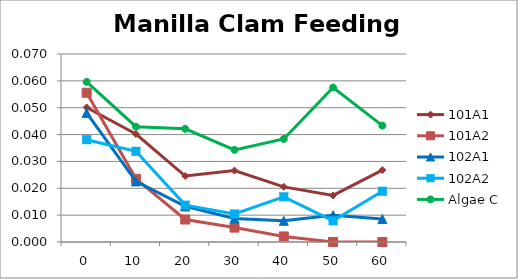
| Category | 101A1 | 101A2 | 102A1 | 102A2 | Algae C |
|---|---|---|---|---|---|
| 0.0 | 0.05 | 0.056 | 0.048 | 0.038 | 0.06 |
| 10.0 | 0.04 | 0.024 | 0.023 | 0.034 | 0.043 |
| 20.0 | 0.025 | 0.008 | 0.013 | 0.014 | 0.042 |
| 30.0 | 0.027 | 0.005 | 0.009 | 0.01 | 0.034 |
| 40.0 | 0.021 | 0.002 | 0.008 | 0.017 | 0.038 |
| 50.0 | 0.017 | 0 | 0.01 | 0.008 | 0.058 |
| 60.0 | 0.027 | 0 | 0.009 | 0.019 | 0.043 |